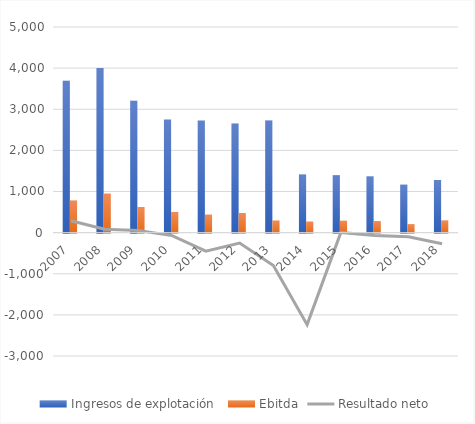
| Category | Ingresos de explotación  | Ebitda |
|---|---|---|
| 2007.0 | 3696 | 780 |
| 2008.0 | 4001 | 948 |
| 2009.0 | 3208 | 623 |
| 2010.0 | 2751 | 502 |
| 2011.0 | 2724 | 437 |
| 2012.0 | 2652 | 477 |
| 2013.0 | 2726 | 296 |
| 2014.0 | 1413 | 268 |
| 2015.0 | 1398 | 289 |
| 2016.0 | 1370 | 281.5 |
| 2017.0 | 1166 | 207.4 |
| 2018.0 | 1280 | 298.3 |